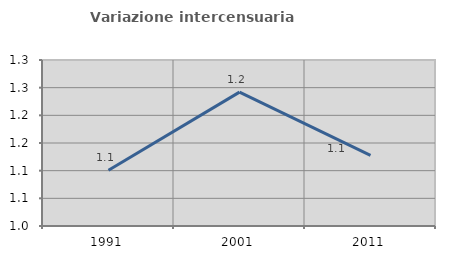
| Category | Variazione intercensuaria annua |
|---|---|
| 1991.0 | 1.101 |
| 2001.0 | 1.242 |
| 2011.0 | 1.128 |